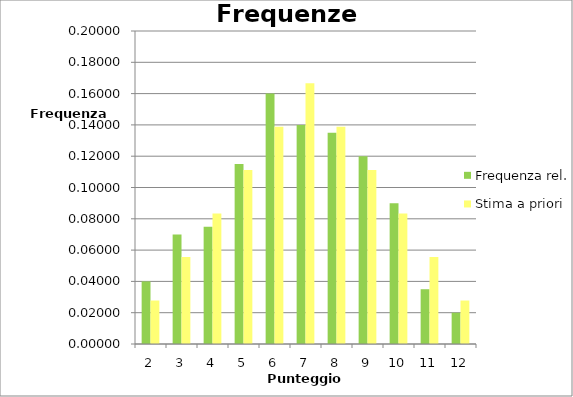
| Category | Frequenza rel. | Stima a priori |
|---|---|---|
| 2.0 | 0.04 | 0.028 |
| 3.0 | 0.07 | 0.056 |
| 4.0 | 0.075 | 0.083 |
| 5.0 | 0.115 | 0.111 |
| 6.0 | 0.16 | 0.139 |
| 7.0 | 0.14 | 0.167 |
| 8.0 | 0.135 | 0.139 |
| 9.0 | 0.12 | 0.111 |
| 10.0 | 0.09 | 0.083 |
| 11.0 | 0.035 | 0.056 |
| 12.0 | 0.02 | 0.028 |